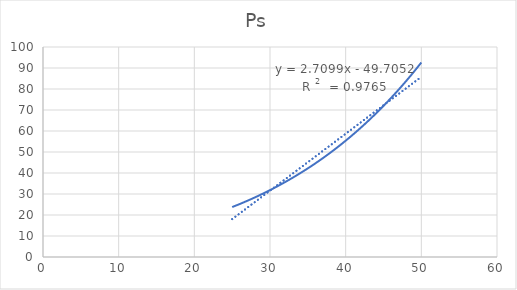
| Category | Ps |
|---|---|
| 25.0 | 23.771 |
| 26.0 | 25.226 |
| 27.0 | 26.757 |
| 28.0 | 28.369 |
| 29.0 | 30.065 |
| 30.0 | 31.848 |
| 31.0 | 33.722 |
| 32.0 | 35.692 |
| 33.0 | 37.761 |
| 34.0 | 39.933 |
| 35.0 | 42.212 |
| 36.0 | 44.603 |
| 37.0 | 47.111 |
| 38.0 | 49.74 |
| 39.0 | 52.495 |
| 40.0 | 55.381 |
| 41.0 | 58.402 |
| 42.0 | 61.565 |
| 43.0 | 64.874 |
| 44.0 | 68.336 |
| 45.0 | 71.955 |
| 46.0 | 75.738 |
| 47.0 | 79.691 |
| 48.0 | 83.82 |
| 49.0 | 88.131 |
| 50.0 | 92.632 |